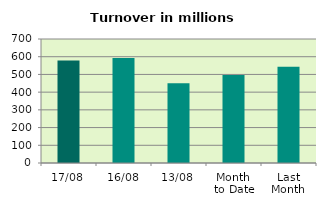
| Category | Series 0 |
|---|---|
| 17/08 | 578.916 |
| 16/08 | 592.435 |
| 13/08 | 450.879 |
| Month 
to Date | 496.95 |
| Last
Month | 542.77 |